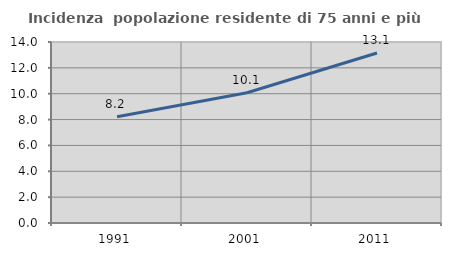
| Category | Incidenza  popolazione residente di 75 anni e più |
|---|---|
| 1991.0 | 8.212 |
| 2001.0 | 10.072 |
| 2011.0 | 13.148 |